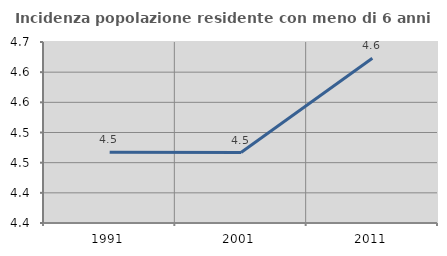
| Category | Incidenza popolazione residente con meno di 6 anni |
|---|---|
| 1991.0 | 4.467 |
| 2001.0 | 4.467 |
| 2011.0 | 4.623 |